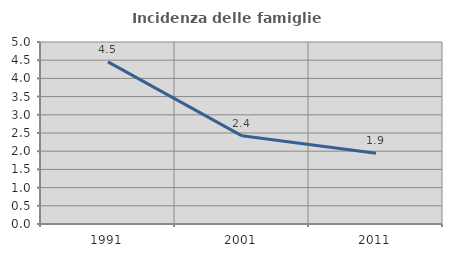
| Category | Incidenza delle famiglie numerose |
|---|---|
| 1991.0 | 4.453 |
| 2001.0 | 2.422 |
| 2011.0 | 1.945 |